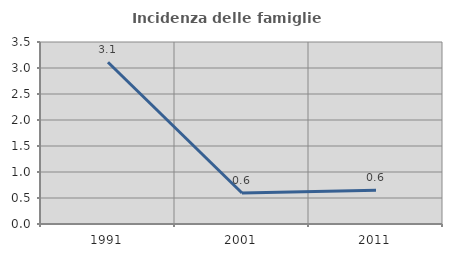
| Category | Incidenza delle famiglie numerose |
|---|---|
| 1991.0 | 3.11 |
| 2001.0 | 0.595 |
| 2011.0 | 0.648 |